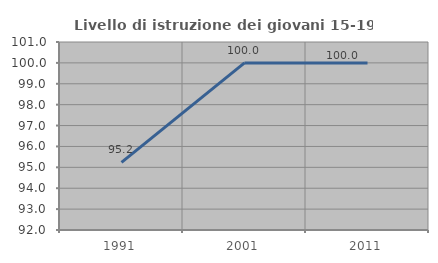
| Category | Livello di istruzione dei giovani 15-19 anni |
|---|---|
| 1991.0 | 95.238 |
| 2001.0 | 100 |
| 2011.0 | 100 |